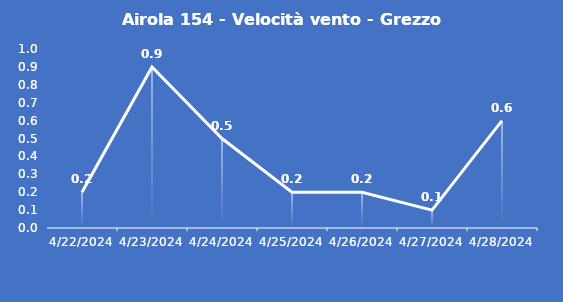
| Category | Airola 154 - Velocità vento - Grezzo (m/s) |
|---|---|
| 4/22/24 | 0.2 |
| 4/23/24 | 0.9 |
| 4/24/24 | 0.5 |
| 4/25/24 | 0.2 |
| 4/26/24 | 0.2 |
| 4/27/24 | 0.1 |
| 4/28/24 | 0.6 |